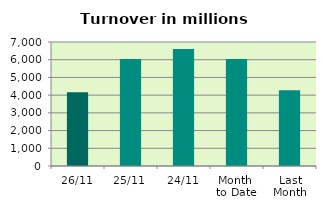
| Category | Series 0 |
|---|---|
| 26/11 | 4159.351 |
| 25/11 | 6038.239 |
| 24/11 | 6606.476 |
| Month 
to Date | 6038.288 |
| Last
Month | 4277.774 |